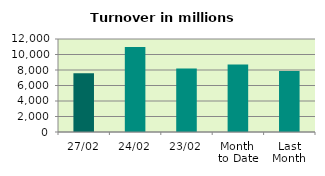
| Category | Series 0 |
|---|---|
| 27/02 | 7594.014 |
| 24/02 | 10958.517 |
| 23/02 | 8197.277 |
| Month 
to Date | 8724.869 |
| Last
Month | 7855.802 |